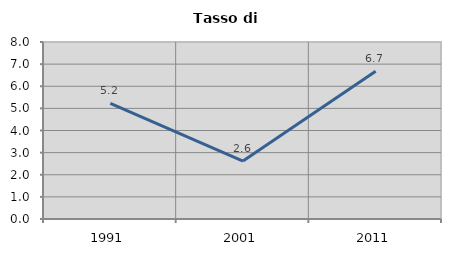
| Category | Tasso di disoccupazione   |
|---|---|
| 1991.0 | 5.23 |
| 2001.0 | 2.618 |
| 2011.0 | 6.674 |